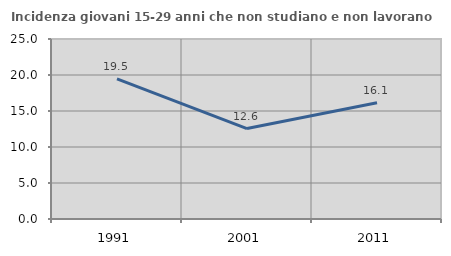
| Category | Incidenza giovani 15-29 anni che non studiano e non lavorano  |
|---|---|
| 1991.0 | 19.466 |
| 2001.0 | 12.563 |
| 2011.0 | 16.149 |